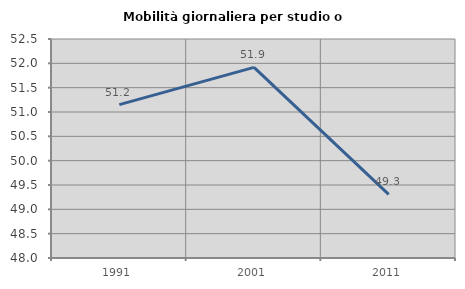
| Category | Mobilità giornaliera per studio o lavoro |
|---|---|
| 1991.0 | 51.151 |
| 2001.0 | 51.916 |
| 2011.0 | 49.309 |